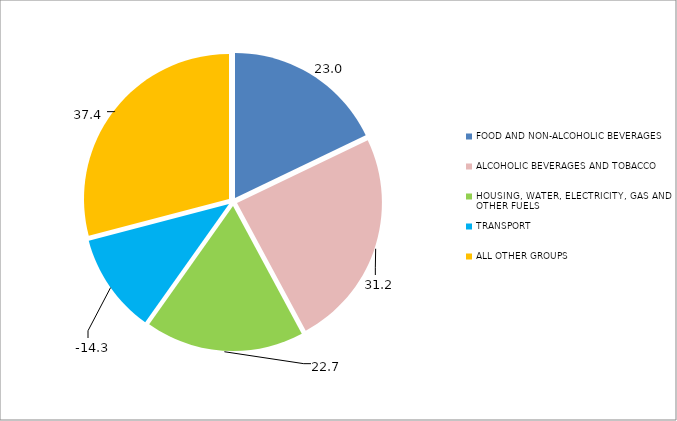
| Category | Series 0 |
|---|---|
| FOOD AND NON-ALCOHOLIC BEVERAGES  | 22.982 |
| ALCOHOLIC BEVERAGES AND TOBACCO | 31.187 |
| HOUSING, WATER, ELECTRICITY, GAS AND OTHER FUELS | 22.721 |
| TRANSPORT | -14.28 |
| ALL OTHER GROUPS | 37.391 |